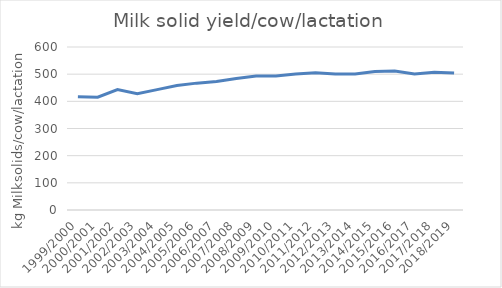
| Category | Series 0 |
|---|---|
| 1999/2000 | 417 |
| 2000/2001 | 415 |
| 2001/2002 | 443 |
| 2002/2003 | 428 |
| 2003/2004 | 443 |
| 2004/2005 | 458 |
| 2005/2006 | 467 |
| 2006/2007 | 473 |
| 2007/2008 | 484 |
| 2008/2009 | 493 |
| 2009/2010 | 493 |
| 2010/2011 | 501 |
| 2011/2012 | 505 |
| 2012/2013 | 501 |
| 2013/2014 | 501 |
| 2014/2015 | 510 |
| 2015/2016 | 512 |
| 2016/2017 | 501 |
| 2017/2018 | 507 |
| 2018/2019 | 504 |